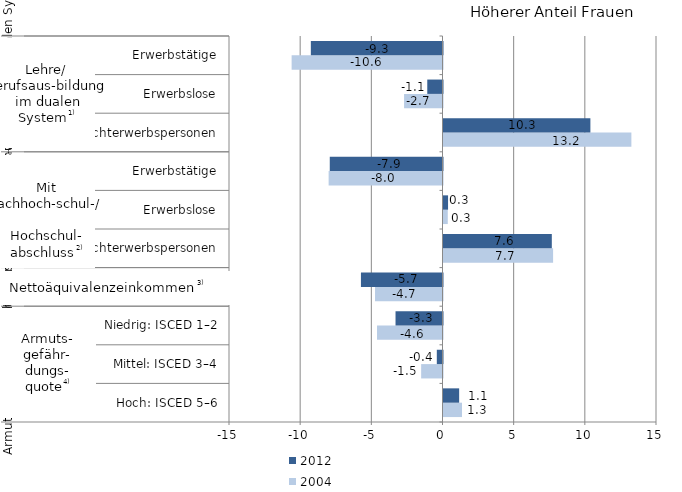
| Category | 2004 | 2012 |
|---|---|---|
| 0 | 1.3 | 1.1 |
| 1 | -1.5 | -0.4 |
| 2 | -4.6 | -3.3 |
| 3 | -4.74 | -5.73 |
| 4 | 7.7 | 7.61 |
| 5 | 0.3 | 0.32 |
| 6 | -8 | -7.92 |
| 7 | 13.2 | 10.32 |
| 8 | -2.7 | -1.07 |
| 9 | -10.6 | -9.25 |